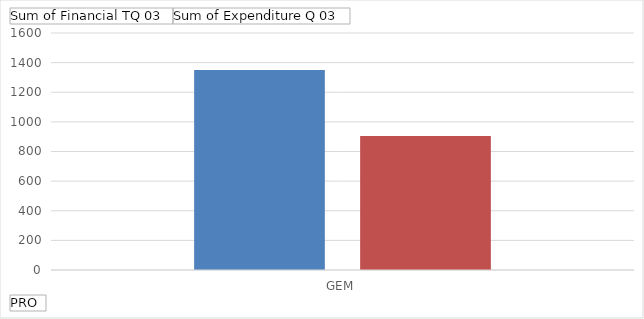
| Category | Sum of Financial TQ 03 | Sum of Expenditure Q 03 |
|---|---|---|
| GEM | 1350 | 904.5 |